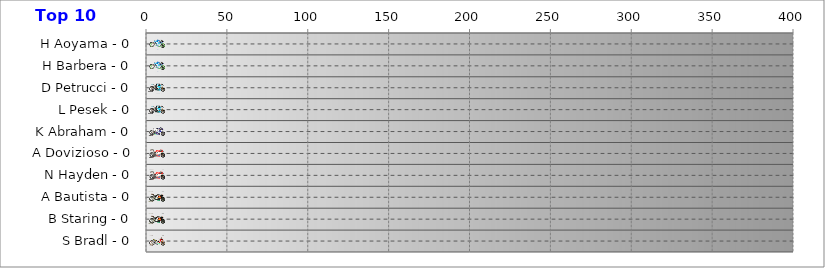
| Category | Avintia Blusens | Came IodaRacing Project | Cardion AB Motoracing | Ducati Team | Go&Fun Honda Gresini | LCR Honda MotoGP | Monster Yamaha Tech 3 | NGM Mobile Forward Racing | Paul Bird Motorsport | Power Electronics Aspar | Pramac Racing Team | Repsol Honda Team | Yamaha Factory Racing | Series 13 | Series 27 |
|---|---|---|---|---|---|---|---|---|---|---|---|---|---|---|---|
| H Aoyama - 0 | 14 | 0 | 0 | 0 | 0 | 0 | 0 | 0 | 0 | 0 | 0 | 0 | 0 | 0 | 0 |
| H Barbera - 0 | 14 | 0 | 0 | 0 | 0 | 0 | 0 | 0 | 0 | 0 | 0 | 0 | 0 | 0 | 0 |
| D Petrucci - 0 | 0 | 14 | 0 | 0 | 0 | 0 | 0 | 0 | 0 | 0 | 0 | 0 | 0 | 0 | 0 |
| L Pesek - 0 | 0 | 14 | 0 | 0 | 0 | 0 | 0 | 0 | 0 | 0 | 0 | 0 | 0 | 0 | 0 |
| K Abraham - 0 | 0 | 0 | 14 | 0 | 0 | 0 | 0 | 0 | 0 | 0 | 0 | 0 | 0 | 0 | 0 |
| A Dovizioso - 0 | 0 | 0 | 0 | 14 | 0 | 0 | 0 | 0 | 0 | 0 | 0 | 0 | 0 | 0 | 0 |
| N Hayden - 0 | 0 | 0 | 0 | 14 | 0 | 0 | 0 | 0 | 0 | 0 | 0 | 0 | 0 | 0 | 0 |
| A Bautista - 0 | 0 | 0 | 0 | 0 | 14 | 0 | 0 | 0 | 0 | 0 | 0 | 0 | 0 | 0 | 0 |
| B Staring - 0 | 0 | 0 | 0 | 0 | 14 | 0 | 0 | 0 | 0 | 0 | 0 | 0 | 0 | 0 | 0 |
| S Bradl - 0 | 0 | 0 | 0 | 0 | 0 | 14 | 0 | 0 | 0 | 0 | 0 | 0 | 0 | 0 | 0 |